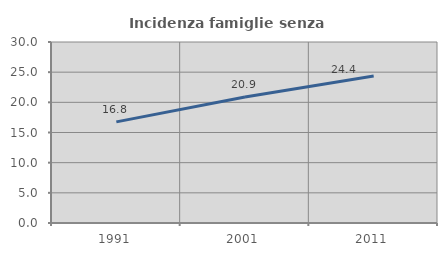
| Category | Incidenza famiglie senza nuclei |
|---|---|
| 1991.0 | 16.76 |
| 2001.0 | 20.896 |
| 2011.0 | 24.357 |